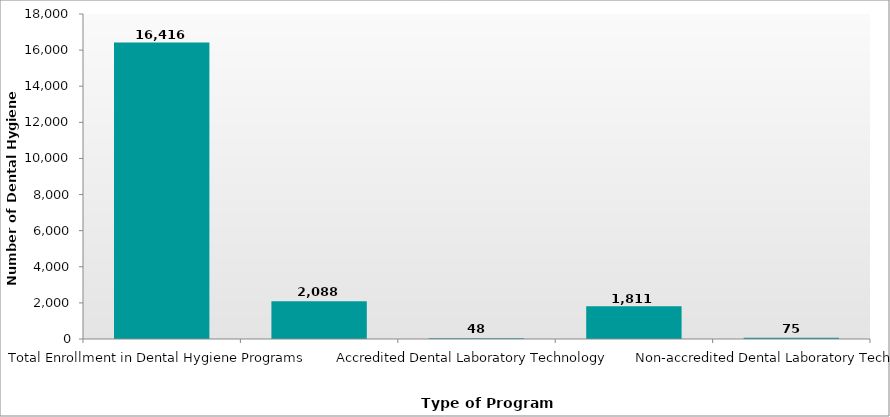
| Category | Number of Dental Hygiene Students |
|---|---|
| Total Enrollment in Dental Hygiene Programs | 16416 |
| Accredited Dental Assisting | 2088 |
| Accredited Dental Laboratory Technology | 48 |
| Non-accredited Dental Assisting | 1811 |
| Non-accredited Dental Laboratory Technology | 75 |